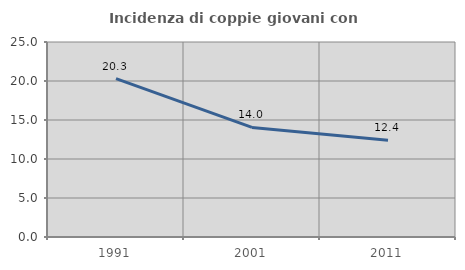
| Category | Incidenza di coppie giovani con figli |
|---|---|
| 1991.0 | 20.313 |
| 2001.0 | 14.048 |
| 2011.0 | 12.418 |